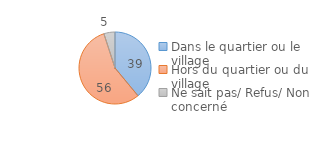
| Category | Series 0 |
|---|---|
| Dans le quartier ou le village | 39 |
| Hors du quartier ou du village | 56 |
| Ne sait pas/ Refus/ Non concerné | 5 |